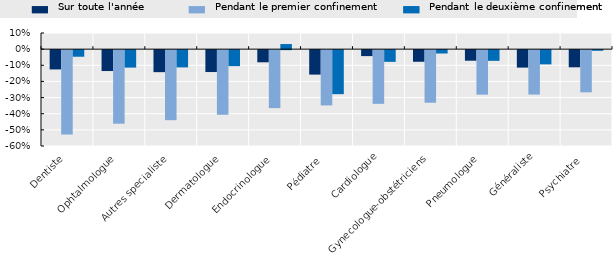
| Category | Sur toute l'année | Pendant le premier confinement | Pendant le deuxième confinement  |
|---|---|---|---|
| Dentiste | -0.12 | -0.523 | -0.041 |
| Ophtalmologue | -0.129 | -0.456 | -0.108 |
| Autres specialiste | -0.136 | -0.434 | -0.107 |
| Dermatologue | -0.136 | -0.4 | -0.099 |
| Endocrinologue | -0.075 | -0.359 | 0.032 |
| Pédiatre  | -0.152 | -0.343 | -0.273 |
| Cardiologue | -0.037 | -0.333 | -0.072 |
| Gynecologue-obstétriciens | -0.072 | -0.326 | -0.021 |
| Pneumologue | -0.065 | -0.276 | -0.066 |
| Généraliste | -0.108 | -0.275 | -0.088 |
| Psychiatre   | -0.106 | -0.261 | -0.004 |